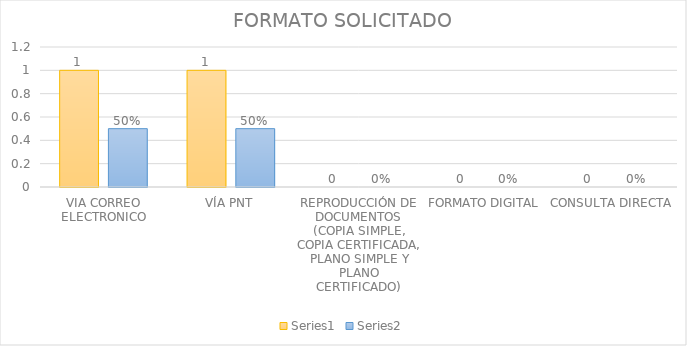
| Category | Series 3 | Series 4 |
|---|---|---|
| VIA CORREO ELECTRONICO | 1 | 0.5 |
| VÍA PNT | 1 | 0.5 |
| REPRODUCCIÓN DE DOCUMENTOS (COPIA SIMPLE, COPIA CERTIFICADA, PLANO SIMPLE Y PLANO CERTIFICADO) | 0 | 0 |
| FORMATO DIGITAL | 0 | 0 |
| CONSULTA DIRECTA | 0 | 0 |